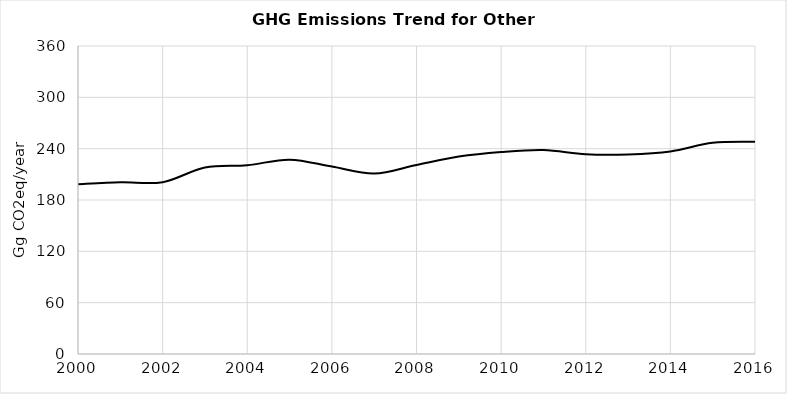
| Category | Series 0 |
|---|---|
| 2000.0 | 198.414 |
| 2001.0 | 200.743 |
| 2002.0 | 200.831 |
| 2003.0 | 217.961 |
| 2004.0 | 220.651 |
| 2005.0 | 227.155 |
| 2006.0 | 219.094 |
| 2007.0 | 210.883 |
| 2008.0 | 220.972 |
| 2009.0 | 230.768 |
| 2010.0 | 236.088 |
| 2011.0 | 238.459 |
| 2012.0 | 233.543 |
| 2013.0 | 233.302 |
| 2014.0 | 236.747 |
| 2015.0 | 246.871 |
| 2016.0 | 248.097 |